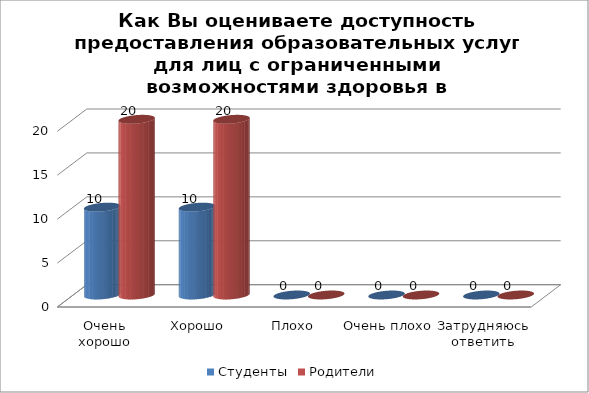
| Category | Студенты | Родители |
|---|---|---|
| Очень хорошо | 10 | 20 |
| Хорошо | 10 | 20 |
| Плохо | 0 | 0 |
| Очень плохо | 0 | 0 |
| Затрудняюсь ответить | 0 | 0 |